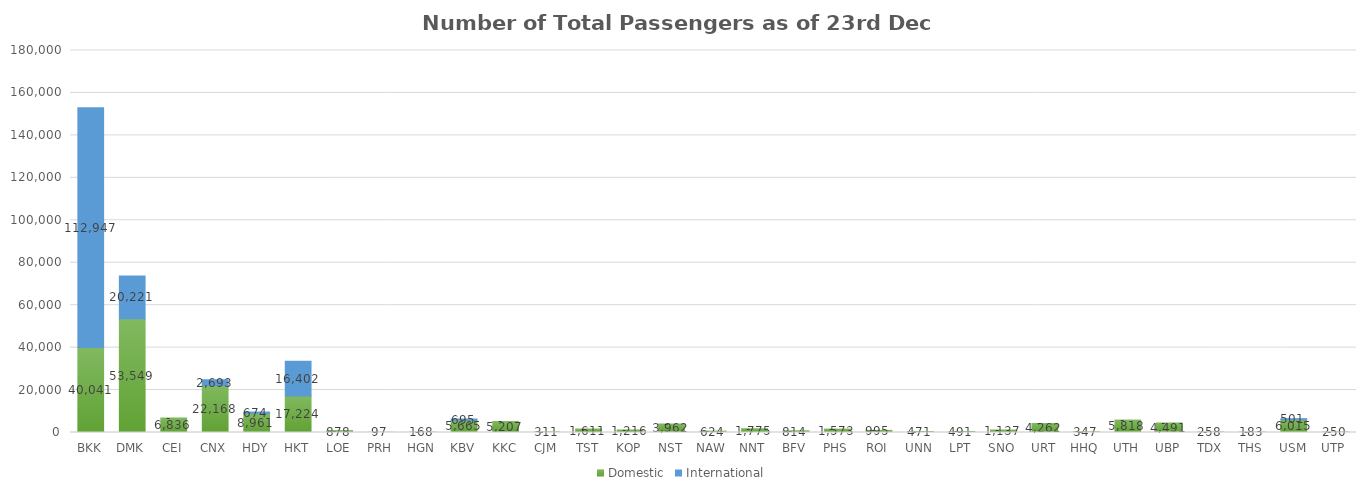
| Category | Domestic | International |
|---|---|---|
| BKK | 40041 | 112947 |
| DMK | 53549 | 20221 |
| CEI | 6836 | 0 |
| CNX | 22168 | 2693 |
| HDY | 8961 | 674 |
| HKT | 17224 | 16402 |
| LOE | 878 | 0 |
| PRH | 97 | 0 |
| HGN | 168 | 0 |
| KBV | 5665 | 695 |
| KKC | 5207 | 0 |
| CJM | 311 | 0 |
| TST | 1611 | 0 |
| KOP | 1216 | 0 |
| NST | 3962 | 0 |
| NAW | 624 | 0 |
| NNT | 1775 | 0 |
| BFV | 814 | 0 |
| PHS | 1573 | 0 |
| ROI | 995 | 0 |
| UNN | 471 | 0 |
| LPT | 491 | 0 |
| SNO | 1137 | 0 |
| URT | 4262 | 0 |
| HHQ | 347 | 0 |
| UTH | 5818 | 0 |
| UBP | 4491 | 0 |
| TDX | 258 | 0 |
| THS | 183 | 0 |
| USM | 6015 | 501 |
| UTP | 250 | 0 |